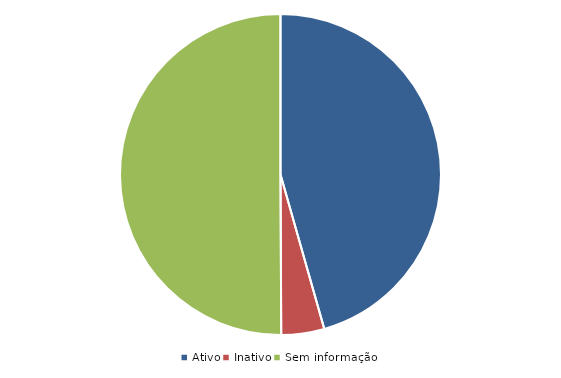
| Category | Percentagem |
|---|---|
| Ativo | 45.601 |
| Inativo | 4.326 |
| Sem informação | 50.073 |